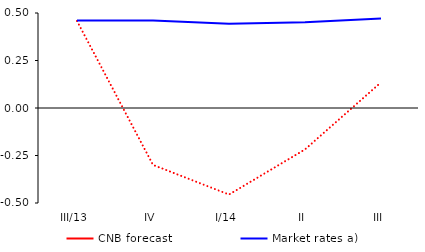
| Category | CNB forecast | Market rates a) |
|---|---|---|
| III/13 | 0.458 | 0.46 |
| IV | -0.299 | 0.46 |
| I/14 | -0.456 | 0.443 |
| II | -0.218 | 0.451 |
| III | 0.135 | 0.471 |